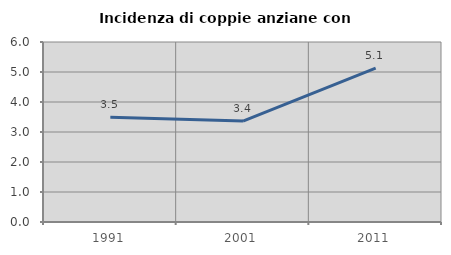
| Category | Incidenza di coppie anziane con figli |
|---|---|
| 1991.0 | 3.492 |
| 2001.0 | 3.365 |
| 2011.0 | 5.128 |